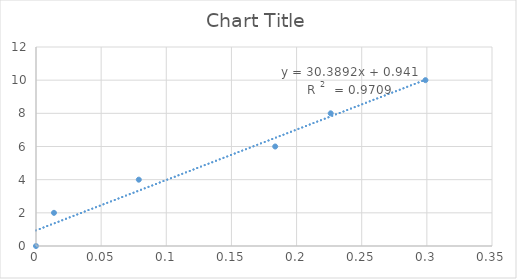
| Category | Series 0 |
|---|---|
| 0.0 | 0 |
| 0.013800000000000007 | 2 |
| 0.0789 | 4 |
| 0.1836 | 6 |
| 0.22619999999999998 | 8 |
| 0.29890000000000005 | 10 |